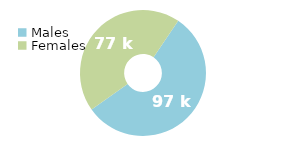
| Category | Series 0 |
|---|---|
| Males | 97 |
| Females | 77 |